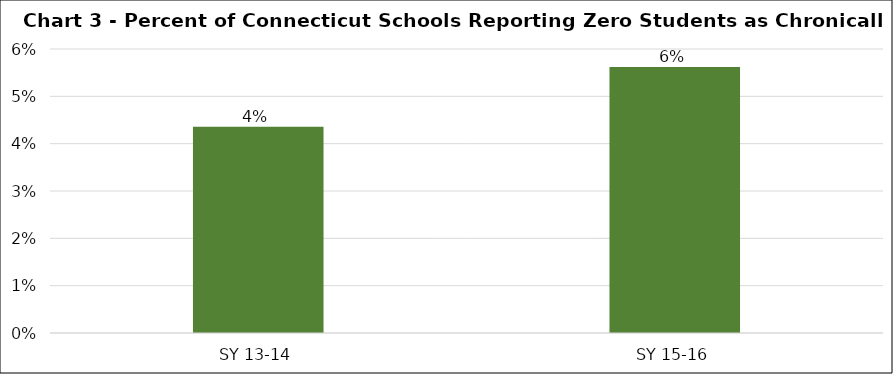
| Category | Series 0 |
|---|---|
| SY 13-14 | 0.044 |
| SY 15-16 | 0.056 |